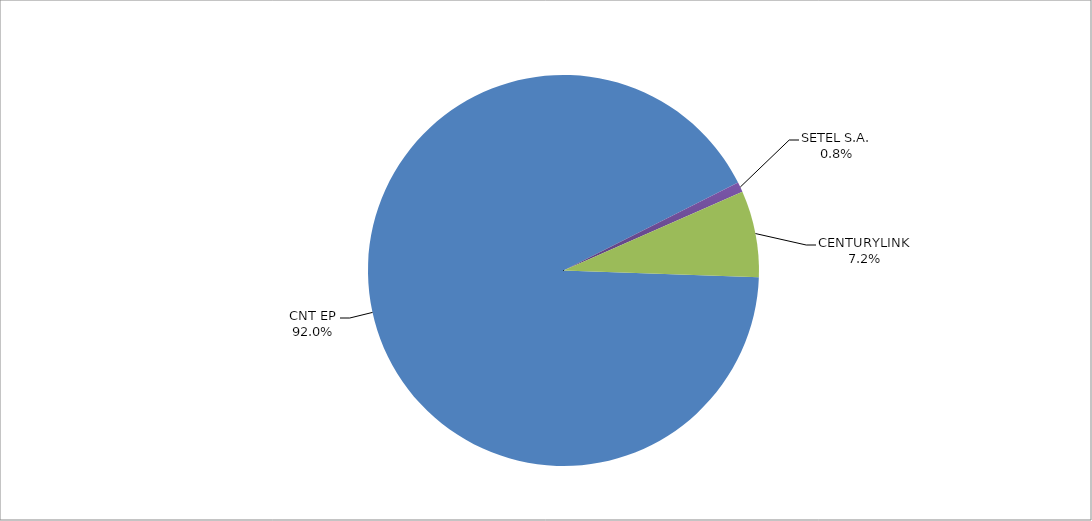
| Category | Series 0 |
|---|---|
| CNT EP | 334 |
| SETEL S.A. | 3 |
| CENTURYLINK | 26 |